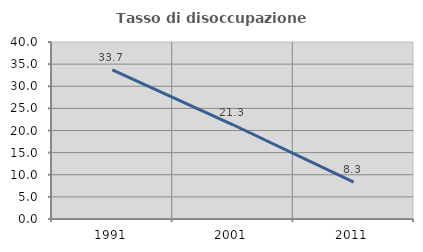
| Category | Tasso di disoccupazione giovanile  |
|---|---|
| 1991.0 | 33.708 |
| 2001.0 | 21.296 |
| 2011.0 | 8.333 |